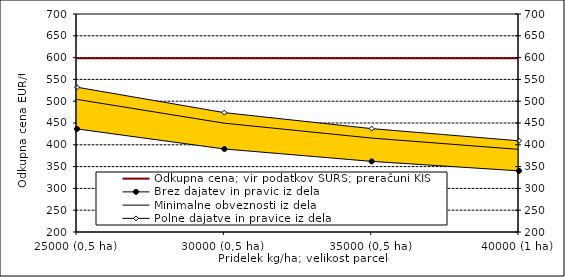
| Category | Odkupna cena; vir podatkov SURS; preračuni KIS |
|---|---|
| 25000 (0,5 ha) | 598.75 |
| 30000 (0,5 ha) | 598.75 |
| 35000 (0,5 ha) | 598.75 |
| 40000 (1 ha) | 598.75 |